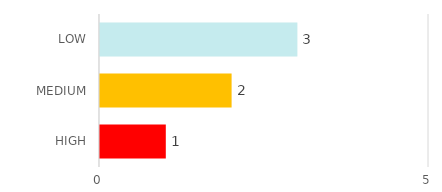
| Category | Series 1 |
|---|---|
| HIGH | 1 |
| MEDIUM | 2 |
| LOW | 3 |